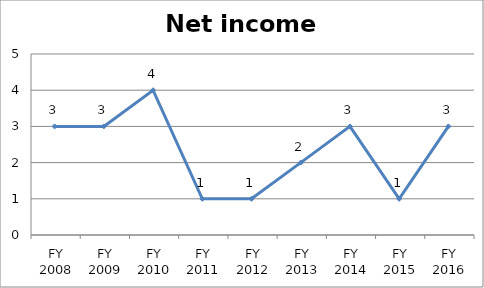
| Category | Net income score |
|---|---|
| FY 2016 | 3 |
| FY 2015 | 1 |
| FY 2014 | 3 |
| FY 2013 | 2 |
| FY 2012 | 1 |
| FY 2011 | 1 |
| FY 2010 | 4 |
| FY 2009 | 3 |
| FY 2008 | 3 |